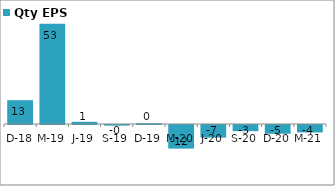
| Category | Qty EPS |
|---|---|
| 2018-12-31 | 12.533 |
| 2019-03-31 | 52.758 |
| 2019-06-30 | 1.151 |
| 2019-09-30 | -0.339 |
| 2019-12-31 | 0.373 |
| 2020-03-31 | -12.418 |
| 2020-06-30 | -6.648 |
| 2020-09-30 | -3.242 |
| 2020-12-31 | -4.604 |
| 2021-03-31 | -3.919 |